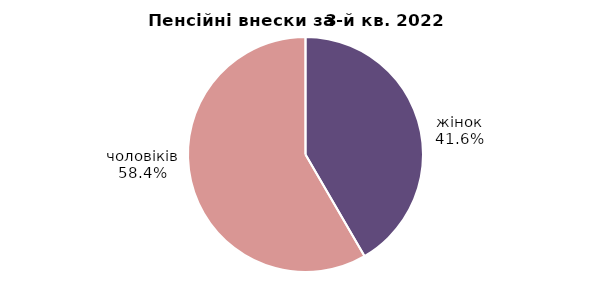
| Category | Series 0 |
|---|---|
| жінок | 30.876 |
| чоловіків | 43.292 |